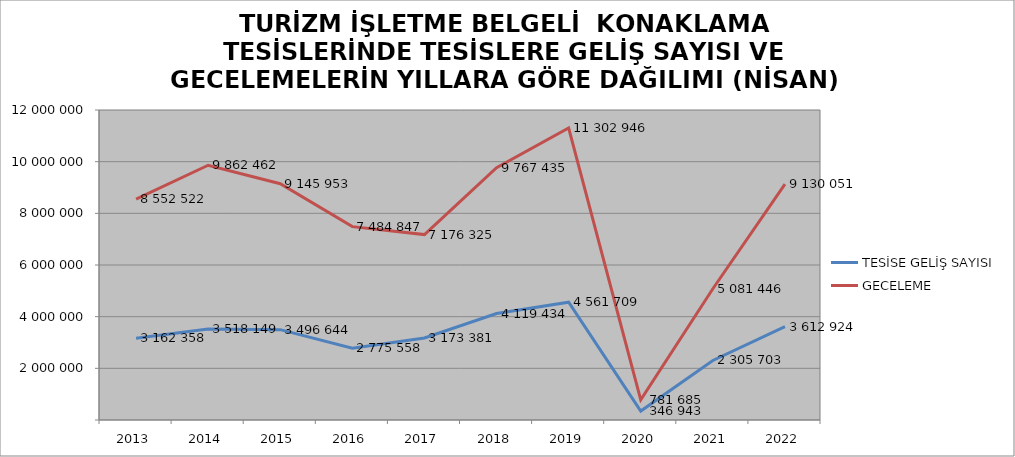
| Category | TESİSE GELİŞ SAYISI | GECELEME |
|---|---|---|
| 2013 | 3162358 | 8552522 |
| 2014 | 3518149 | 9862462 |
| 2015 | 3496644 | 9145953 |
| 2016 | 2775558 | 7484847 |
| 2017 | 3173381 | 7176325 |
| 2018 | 4119434 | 9767435 |
| 2019 | 4561709 | 11302946 |
| 2020 | 346943 | 781685 |
| 2021 | 2305703 | 5081446 |
| 2022 | 3612924 | 9130051 |